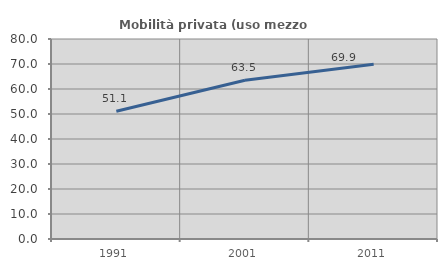
| Category | Mobilità privata (uso mezzo privato) |
|---|---|
| 1991.0 | 51.129 |
| 2001.0 | 63.521 |
| 2011.0 | 69.917 |